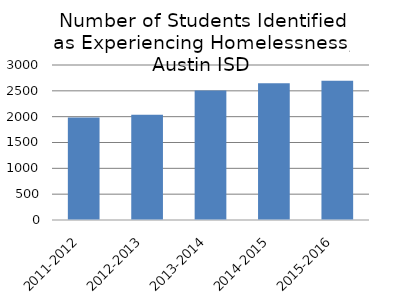
| Category | Series 0 |
|---|---|
| 2011-2012 | 1986 |
| 2012-2013 | 2038 |
| 2013-2014 | 2505 |
| 2014-2015 | 2648 |
| 2015-2016 | 2693 |